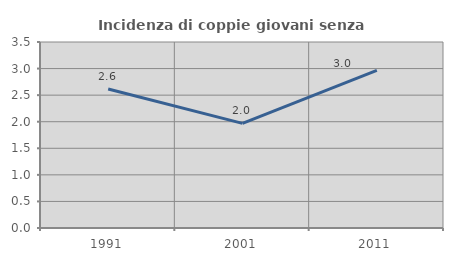
| Category | Incidenza di coppie giovani senza figli |
|---|---|
| 1991.0 | 2.614 |
| 2001.0 | 1.969 |
| 2011.0 | 2.966 |